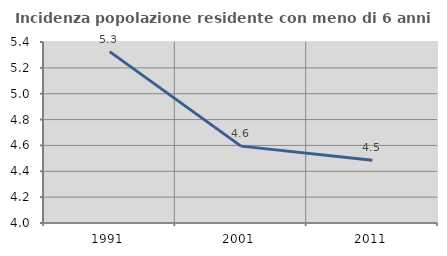
| Category | Incidenza popolazione residente con meno di 6 anni |
|---|---|
| 1991.0 | 5.325 |
| 2001.0 | 4.595 |
| 2011.0 | 4.485 |